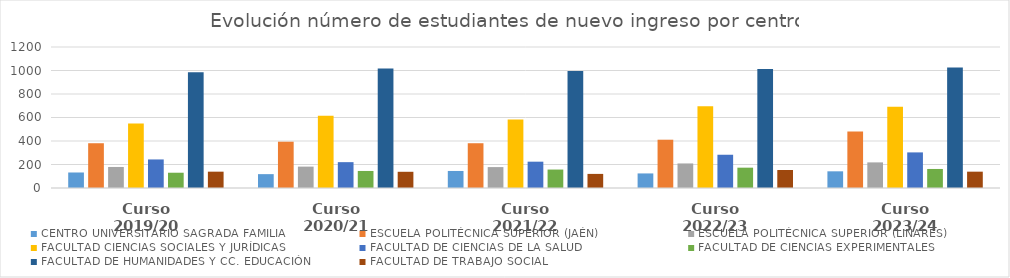
| Category | CENTRO UNIVERSITARIO SAGRADA FAMILIA | ESCUELA POLITÉCNICA SUPERIOR (JAÉN) | ESCUELA POLITÉCNICA SUPERIOR (LINARES) | FACULTAD CIENCIAS SOCIALES Y JURÍDICAS | FACULTAD DE CIENCIAS DE LA SALUD | FACULTAD DE CIENCIAS EXPERIMENTALES | FACULTAD DE HUMANIDADES Y CC. EDUCACIÓN | FACULTAD DE TRABAJO SOCIAL |
|---|---|---|---|---|---|---|---|---|
| Curso 2019/20 | 132 | 381 | 179 | 548 | 243 | 130 | 985 | 139 |
| Curso 2020/21 | 118 | 394 | 182 | 615 | 220 | 145 | 1018 | 138 |
| Curso 2021/22 | 145 | 381 | 178 | 582 | 224 | 157 | 995 | 120 |
| Curso 2022/23 | 124 | 411 | 209 | 696 | 283 | 173 | 1013 | 153 |
| Curso 2023/24 | 142 | 480 | 218 | 691 | 303 | 162 | 1025 | 139 |